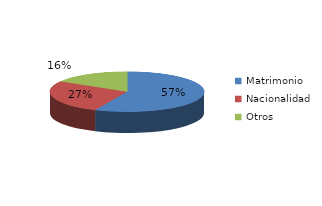
| Category | Series 0 |
|---|---|
| Matrimonio | 690 |
| Nacionalidad | 328 |
| Otros | 199 |